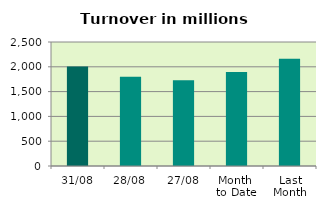
| Category | Series 0 |
|---|---|
| 31/08 | 2004.362 |
| 28/08 | 1800.56 |
| 27/08 | 1729.422 |
| Month 
to Date | 1896.825 |
| Last
Month | 2162.227 |